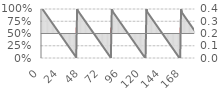
| Category | APU |
|---|---|
| 0 | 0 |
| 1 | 0 |
| 2 | 0 |
| 3 | 0 |
| 4 | 0 |
| 5 | 0 |
| 6 | 0 |
| 7 | 0 |
| 8 | 0 |
| 9 | 0 |
| 10 | 0 |
| 11 | 0 |
| 12 | 0 |
| 13 | 0 |
| 14 | 0 |
| 15 | 0 |
| 16 | 0 |
| 17 | 0 |
| 18 | 0 |
| 19 | 0 |
| 20 | 0 |
| 21 | 0 |
| 22 | 0 |
| 23 | 0 |
| 24 | 0 |
| 25 | 0 |
| 26 | 0 |
| 27 | 0 |
| 28 | 0 |
| 29 | 0 |
| 30 | 0 |
| 31 | 0 |
| 32 | 0 |
| 33 | 0 |
| 34 | 0 |
| 35 | 0 |
| 36 | 0 |
| 37 | 0 |
| 38 | 0 |
| 39 | 0 |
| 40 | 0 |
| 41 | 248100 |
| 42 | 0 |
| 43 | 0 |
| 44 | 0 |
| 45 | 0 |
| 46 | 0 |
| 47 | 0 |
| 48 | 0 |
| 49 | 0 |
| 50 | 0 |
| 51 | 0 |
| 52 | 0 |
| 53 | 0 |
| 54 | 0 |
| 55 | 0 |
| 56 | 0 |
| 57 | 0 |
| 58 | 0 |
| 59 | 0 |
| 60 | 0 |
| 61 | 0 |
| 62 | 0 |
| 63 | 0 |
| 64 | 0 |
| 65 | 0 |
| 66 | 0 |
| 67 | 0 |
| 68 | 0 |
| 69 | 0 |
| 70 | 0 |
| 71 | 0 |
| 72 | 0 |
| 73 | 0 |
| 74 | 0 |
| 75 | 0 |
| 76 | 0 |
| 77 | 0 |
| 78 | 0 |
| 79 | 0 |
| 80 | 0 |
| 81 | 0 |
| 82 | 248100 |
| 83 | 0 |
| 84 | 0 |
| 85 | 0 |
| 86 | 0 |
| 87 | 0 |
| 88 | 0 |
| 89 | 0 |
| 90 | 0 |
| 91 | 0 |
| 92 | 0 |
| 93 | 0 |
| 94 | 0 |
| 95 | 0 |
| 96 | 0 |
| 97 | 0 |
| 98 | 0 |
| 99 | 0 |
| 100 | 0 |
| 101 | 0 |
| 102 | 0 |
| 103 | 0 |
| 104 | 0 |
| 105 | 0 |
| 106 | 0 |
| 107 | 0 |
| 108 | 0 |
| 109 | 0 |
| 110 | 0 |
| 111 | 0 |
| 112 | 0 |
| 113 | 0 |
| 114 | 0 |
| 115 | 0 |
| 116 | 0 |
| 117 | 0 |
| 118 | 0 |
| 119 | 0 |
| 120 | 0 |
| 121 | 0 |
| 122 | 0 |
| 123 | 248100 |
| 124 | 0 |
| 125 | 0 |
| 126 | 0 |
| 127 | 0 |
| 128 | 0 |
| 129 | 0 |
| 130 | 0 |
| 131 | 0 |
| 132 | 0 |
| 133 | 0 |
| 134 | 0 |
| 135 | 0 |
| 136 | 0 |
| 137 | 0 |
| 138 | 0 |
| 139 | 0 |
| 140 | 0 |
| 141 | 0 |
| 142 | 0 |
| 143 | 0 |
| 144 | 0 |
| 145 | 0 |
| 146 | 0 |
| 147 | 0 |
| 148 | 0 |
| 149 | 0 |
| 150 | 0 |
| 151 | 0 |
| 152 | 0 |
| 153 | 0 |
| 154 | 0 |
| 155 | 0 |
| 156 | 0 |
| 157 | 0 |
| 158 | 0 |
| 159 | 0 |
| 160 | 0 |
| 161 | 0 |
| 162 | 0 |
| 163 | 0 |
| 164 | 248100 |
| 165 | 0 |
| 166 | 0 |
| 167 | 0 |
| 168 | 0 |
| 169 | 0 |
| 170 | 0 |
| 171 | 0 |
| 172 | 0 |
| 173 | 0 |
| 174 | 0 |
| 175 | 0 |
| 176 | 0 |
| 177 | 0 |
| 178 | 0 |
| 179 | 0 |
| 180 | 0 |